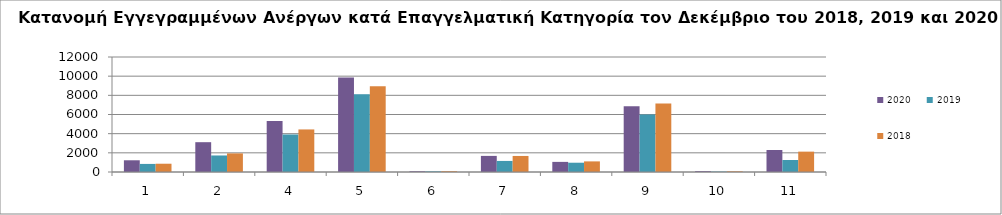
| Category | 2020 | 2019 | 2018 |
|---|---|---|---|
| 1.0 | 1223 | 843 | 864 |
| 2.0 | 3111 | 1724 | 1942 |
| 4.0 | 5325 | 3914 | 4441 |
| 5.0 | 9870 | 8117 | 8951 |
| 6.0 | 76 | 66 | 83 |
| 7.0 | 1680 | 1155 | 1674 |
| 8.0 | 1055 | 969 | 1107 |
| 9.0 | 6864 | 6012 | 7157 |
| 10.0 | 89 | 42 | 69 |
| 11.0 | 2293 | 1250 | 2125 |